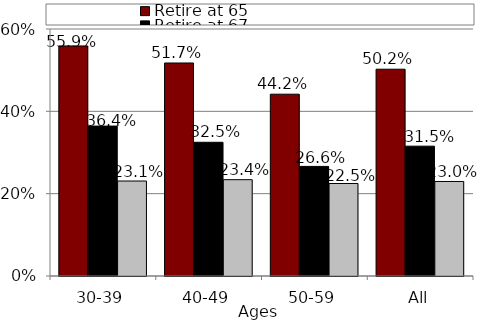
| Category | Retire at 65 | Retire at 67 | Retire at 67 and save more |
|---|---|---|---|
| 30-39 | 0.559 | 0.364 | 0.231 |
| 40-49 | 0.517 | 0.325 | 0.234 |
| 50-59 | 0.442 | 0.266 | 0.225 |
| All | 0.502 | 0.315 | 0.23 |